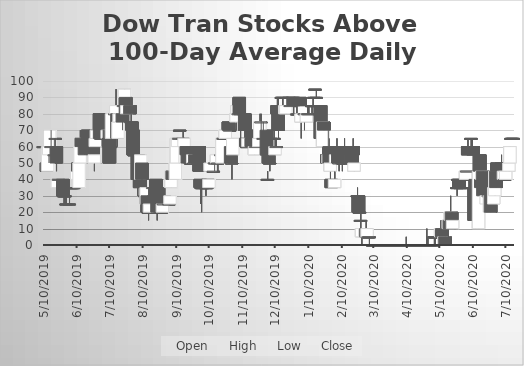
| Category | Open | High | Low | Close |
|---|---|---|---|---|
| 5/10/19 | 60 | 70 | 60 | 60 |
| 5/13/19 | 50 | 55 | 45 | 45 |
| 5/14/19 | 45 | 60 | 45 | 60 |
| 5/15/19 | 55 | 60 | 50 | 60 |
| 5/16/19 | 60 | 70 | 60 | 70 |
| 5/17/19 | 60 | 70 | 60 | 60 |
| 5/20/19 | 55 | 65 | 55 | 55 |
| 5/21/19 | 65 | 65 | 60 | 65 |
| 5/22/19 | 60 | 60 | 45 | 50 |
| 5/23/19 | 35 | 40 | 35 | 40 |
| 5/24/19 | 40 | 40 | 40 | 40 |
| 5/28/19 | 40 | 40 | 30 | 30 |
| 5/29/19 | 30 | 30 | 25 | 30 |
| 5/30/19 | 30 | 30 | 25 | 30 |
| 5/31/19 | 25 | 30 | 25 | 25 |
| 6/3/19 | 25 | 30 | 25 | 25 |
| 6/4/19 | 35 | 35 | 35 | 35 |
| 6/5/19 | 35 | 35 | 35 | 35 |
| 6/6/19 | 35 | 35 | 35 | 35 |
| 6/7/19 | 35 | 40 | 35 | 35 |
| 6/10/19 | 40 | 50 | 40 | 45 |
| 6/11/19 | 50 | 50 | 40 | 45 |
| 6/12/19 | 35 | 50 | 35 | 50 |
| 6/13/19 | 50 | 70 | 50 | 65 |
| 6/14/19 | 65 | 65 | 60 | 60 |
| 6/17/19 | 60 | 60 | 55 | 55 |
| 6/18/19 | 60 | 65 | 60 | 60 |
| 6/19/19 | 60 | 60 | 60 | 60 |
| 6/20/19 | 70 | 70 | 55 | 60 |
| 6/21/19 | 60 | 70 | 55 | 60 |
| 6/24/19 | 60 | 60 | 60 | 60 |
| 6/25/19 | 60 | 60 | 50 | 55 |
| 6/26/19 | 50 | 60 | 45 | 55 |
| 6/27/19 | 60 | 65 | 60 | 65 |
| 6/28/19 | 65 | 70 | 65 | 70 |
| 7/1/19 | 80 | 80 | 65 | 65 |
| 7/2/19 | 65 | 70 | 65 | 65 |
| 7/3/19 | 65 | 70 | 65 | 65 |
| 7/5/19 | 70 | 70 | 65 | 65 |
| 7/8/19 | 65 | 70 | 60 | 70 |
| 7/9/19 | 65 | 70 | 55 | 60 |
| 7/10/19 | 70 | 70 | 50 | 50 |
| 7/11/19 | 60 | 65 | 55 | 60 |
| 7/12/19 | 65 | 85 | 65 | 80 |
| 7/15/19 | 80 | 80 | 80 | 80 |
| 7/16/19 | 80 | 95 | 80 | 85 |
| 7/17/19 | 80 | 80 | 60 | 65 |
| 7/18/19 | 65 | 75 | 65 | 75 |
| 7/19/19 | 75 | 85 | 75 | 80 |
| 7/22/19 | 80 | 85 | 70 | 75 |
| 7/23/19 | 85 | 85 | 80 | 85 |
| 7/24/19 | 90 | 95 | 90 | 95 |
| 7/25/19 | 90 | 90 | 80 | 80 |
| 7/26/19 | 80 | 85 | 80 | 85 |
| 7/29/19 | 85 | 85 | 80 | 80 |
| 7/30/19 | 75 | 80 | 75 | 75 |
| 7/31/19 | 75 | 75 | 70 | 70 |
| 8/1/19 | 70 | 75 | 55 | 55 |
| 8/2/19 | 55 | 55 | 55 | 55 |
| 8/5/19 | 55 | 55 | 30 | 40 |
| 8/6/19 | 55 | 55 | 35 | 45 |
| 8/7/19 | 40 | 40 | 25 | 35 |
| 8/8/19 | 40 | 55 | 35 | 55 |
| 8/9/19 | 50 | 50 | 35 | 40 |
| 8/12/19 | 30 | 35 | 25 | 30 |
| 8/13/19 | 25 | 50 | 25 | 35 |
| 8/14/19 | 30 | 30 | 20 | 20 |
| 8/15/19 | 20 | 20 | 15 | 20 |
| 8/16/19 | 20 | 25 | 20 | 25 |
| 8/19/19 | 35 | 40 | 30 | 35 |
| 8/20/19 | 30 | 35 | 30 | 30 |
| 8/21/19 | 35 | 35 | 30 | 30 |
| 8/22/19 | 40 | 40 | 30 | 30 |
| 8/23/19 | 35 | 35 | 15 | 20 |
| 8/26/19 | 20 | 20 | 20 | 20 |
| 8/27/19 | 20 | 20 | 20 | 20 |
| 8/28/19 | 20 | 25 | 20 | 25 |
| 8/29/19 | 25 | 30 | 25 | 25 |
| 8/30/19 | 30 | 35 | 25 | 30 |
| 9/3/19 | 25 | 25 | 25 | 25 |
| 9/4/19 | 25 | 30 | 25 | 30 |
| 9/5/19 | 35 | 45 | 35 | 45 |
| 9/6/19 | 45 | 45 | 40 | 40 |
| 9/9/19 | 40 | 50 | 40 | 50 |
| 9/10/19 | 50 | 65 | 50 | 65 |
| 9/11/19 | 60 | 65 | 60 | 65 |
| 9/12/19 | 65 | 65 | 65 | 65 |
| 9/13/19 | 70 | 70 | 70 | 70 |
| 9/16/19 | 65 | 70 | 65 | 65 |
| 9/17/19 | 60 | 65 | 55 | 65 |
| 9/18/19 | 50 | 60 | 50 | 60 |
| 9/19/19 | 60 | 60 | 55 | 55 |
| 9/20/19 | 60 | 60 | 50 | 50 |
| 9/23/19 | 50 | 50 | 50 | 50 |
| 9/24/19 | 50 | 50 | 50 | 50 |
| 9/25/19 | 50 | 55 | 50 | 55 |
| 9/26/19 | 50 | 50 | 50 | 50 |
| 9/27/19 | 55 | 55 | 50 | 50 |
| 9/30/19 | 50 | 55 | 50 | 50 |
| 10/1/19 | 60 | 60 | 45 | 45 |
| 10/2/19 | 40 | 40 | 25 | 35 |
| 10/3/19 | 35 | 35 | 20 | 35 |
| 10/4/19 | 35 | 35 | 35 | 35 |
| 10/7/19 | 35 | 35 | 30 | 35 |
| 10/8/19 | 35 | 40 | 35 | 35 |
| 10/9/19 | 40 | 40 | 35 | 40 |
| 10/10/19 | 35 | 40 | 35 | 40 |
| 10/11/19 | 45 | 50 | 45 | 50 |
| 10/14/19 | 45 | 45 | 45 | 45 |
| 10/15/19 | 50 | 50 | 45 | 50 |
| 10/16/19 | 50 | 55 | 50 | 50 |
| 10/17/19 | 50 | 55 | 50 | 55 |
| 10/18/19 | 50 | 55 | 45 | 50 |
| 10/21/19 | 55 | 55 | 50 | 55 |
| 10/22/19 | 50 | 65 | 50 | 65 |
| 10/23/19 | 65 | 65 | 65 | 65 |
| 10/24/19 | 65 | 65 | 65 | 65 |
| 10/25/19 | 65 | 70 | 65 | 70 |
| 10/28/19 | 75 | 75 | 70 | 70 |
| 10/29/19 | 70 | 70 | 70 | 70 |
| 10/30/19 | 60 | 60 | 50 | 50 |
| 10/31/19 | 50 | 50 | 40 | 50 |
| 11/1/19 | 55 | 65 | 50 | 65 |
| 11/4/19 | 75 | 80 | 70 | 80 |
| 11/5/19 | 80 | 85 | 80 | 85 |
| 11/6/19 | 80 | 80 | 80 | 80 |
| 11/7/19 | 90 | 90 | 80 | 80 |
| 11/8/19 | 80 | 85 | 65 | 80 |
| 11/11/19 | 80 | 80 | 70 | 80 |
| 11/12/19 | 80 | 80 | 65 | 70 |
| 11/13/19 | 65 | 65 | 60 | 60 |
| 11/14/19 | 60 | 60 | 60 | 60 |
| 11/15/19 | 60 | 65 | 60 | 65 |
| 11/18/19 | 65 | 65 | 60 | 60 |
| 11/19/19 | 70 | 70 | 60 | 60 |
| 11/20/19 | 60 | 60 | 60 | 60 |
| 11/21/19 | 55 | 60 | 55 | 60 |
| 11/22/19 | 60 | 60 | 60 | 60 |
| 11/25/19 | 60 | 65 | 60 | 65 |
| 11/26/19 | 65 | 80 | 65 | 75 |
| 11/27/19 | 75 | 80 | 60 | 75 |
| 11/29/19 | 65 | 75 | 65 | 65 |
| 12/2/19 | 70 | 70 | 55 | 55 |
| 12/3/19 | 40 | 45 | 40 | 40 |
| 12/4/19 | 55 | 60 | 50 | 50 |
| 12/5/19 | 50 | 55 | 45 | 50 |
| 12/6/19 | 65 | 70 | 55 | 65 |
| 12/9/19 | 65 | 70 | 65 | 65 |
| 12/10/19 | 55 | 65 | 55 | 60 |
| 12/11/19 | 60 | 65 | 60 | 60 |
| 12/12/19 | 85 | 90 | 75 | 80 |
| 12/13/19 | 85 | 90 | 65 | 70 |
| 12/16/19 | 90 | 90 | 90 | 90 |
| 12/17/19 | 90 | 90 | 85 | 90 |
| 12/18/19 | 85 | 85 | 80 | 80 |
| 12/19/19 | 80 | 85 | 80 | 85 |
| 12/20/19 | 80 | 85 | 80 | 85 |
| 12/23/19 | 90 | 90 | 90 | 90 |
| 12/24/19 | 85 | 90 | 85 | 85 |
| 12/26/19 | 90 | 90 | 90 | 90 |
| 12/27/19 | 90 | 90 | 80 | 85 |
| 12/30/19 | 80 | 85 | 80 | 80 |
| 12/31/19 | 80 | 80 | 80 | 80 |
| 1/2/20 | 90 | 90 | 85 | 85 |
| 1/3/20 | 75 | 80 | 65 | 80 |
| 1/6/20 | 80 | 80 | 70 | 80 |
| 1/7/20 | 80 | 80 | 75 | 80 |
| 1/8/20 | 75 | 80 | 75 | 80 |
| 1/9/20 | 80 | 85 | 80 | 80 |
| 1/10/20 | 80 | 85 | 80 | 80 |
| 1/13/20 | 85 | 85 | 80 | 85 |
| 1/14/20 | 85 | 90 | 85 | 85 |
| 1/15/20 | 90 | 90 | 90 | 90 |
| 1/16/20 | 95 | 95 | 95 | 95 |
| 1/17/20 | 90 | 95 | 90 | 90 |
| 1/21/20 | 85 | 85 | 65 | 65 |
| 1/22/20 | 75 | 80 | 70 | 70 |
| 1/23/20 | 60 | 75 | 60 | 75 |
| 1/24/20 | 75 | 75 | 70 | 70 |
| 1/27/20 | 55 | 60 | 50 | 50 |
| 1/28/20 | 50 | 70 | 50 | 55 |
| 1/29/20 | 60 | 65 | 50 | 50 |
| 1/30/20 | 45 | 50 | 40 | 50 |
| 1/31/20 | 40 | 40 | 35 | 35 |
| 2/3/20 | 35 | 45 | 35 | 40 |
| 2/4/20 | 50 | 55 | 50 | 55 |
| 2/5/20 | 60 | 65 | 55 | 60 |
| 2/6/20 | 60 | 60 | 50 | 50 |
| 2/7/20 | 50 | 55 | 45 | 50 |
| 2/10/20 | 50 | 55 | 45 | 50 |
| 2/11/20 | 60 | 60 | 55 | 55 |
| 2/12/20 | 60 | 65 | 55 | 55 |
| 2/13/20 | 60 | 60 | 55 | 60 |
| 2/14/20 | 60 | 60 | 55 | 55 |
| 2/18/20 | 60 | 60 | 50 | 55 |
| 2/19/20 | 55 | 55 | 50 | 50 |
| 2/20/20 | 60 | 65 | 55 | 55 |
| 2/21/20 | 45 | 50 | 45 | 50 |
| 2/24/20 | 30 | 35 | 30 | 30 |
| 2/25/20 | 30 | 30 | 20 | 20 |
| 2/26/20 | 20 | 20 | 20 | 20 |
| 2/27/20 | 15 | 20 | 10 | 15 |
| 2/28/20 | 5 | 10 | 0.01 | 10 |
| 3/2/20 | 5 | 10 | 5 | 10 |
| 3/3/20 | 10 | 15 | 5 | 5 |
| 3/4/20 | 5 | 10 | 5 | 10 |
| 3/5/20 | 5 | 5 | 5 | 5 |
| 3/6/20 | 5 | 5 | 0.01 | 5 |
| 3/9/20 | 0.01 | 0.01 | 0.01 | 0.01 |
| 3/10/20 | 0.01 | 0.01 | 0.01 | 0.01 |
| 3/11/20 | 0.01 | 0.01 | 0.01 | 0.01 |
| 3/12/20 | 0.01 | 0.01 | 0.01 | 0.01 |
| 3/13/20 | 0.01 | 0.01 | 0.01 | 0.01 |
| 3/16/20 | 0.01 | 0.01 | 0.01 | 0.01 |
| 3/17/20 | 0.01 | 0.01 | 0.01 | 0.01 |
| 3/18/20 | 0.01 | 0.01 | 0.01 | 0.01 |
| 3/19/20 | 0.01 | 0.01 | 0.01 | 0.01 |
| 3/20/20 | 0.01 | 0.01 | 0.01 | 0.01 |
| 3/23/20 | 0.01 | 0.01 | 0.01 | 0.01 |
| 3/24/20 | 0.01 | 0.01 | 0.01 | 0.01 |
| 3/25/20 | 0.01 | 0.01 | 0.01 | 0.01 |
| 3/26/20 | 0.01 | 0.01 | 0.01 | 0.01 |
| 3/27/20 | 0.01 | 0.01 | 0.01 | 0.01 |
| 3/30/20 | 0.01 | 0.01 | 0.01 | 0.01 |
| 3/31/20 | 0.01 | 0.01 | 0.01 | 0.01 |
| 4/1/20 | 0.01 | 0.01 | 0.01 | 0.01 |
| 4/2/20 | 0.01 | 0.01 | 0.01 | 0.01 |
| 4/3/20 | 0.01 | 0.01 | 0.01 | 0.01 |
| 4/6/20 | 0.01 | 0.01 | 0.01 | 0.01 |
| 4/7/20 | 0.01 | 0.01 | 0.01 | 0.01 |
| 4/8/20 | 0.01 | 0.01 | 0.01 | 0.01 |
| 4/9/20 | 0.01 | 5 | 0.01 | 0.01 |
| 4/13/20 | 0.01 | 0.01 | 0.01 | 0.01 |
| 4/14/20 | 0.01 | 0.01 | 0.01 | 0.01 |
| 4/15/20 | 0.01 | 0.01 | 0.01 | 0.01 |
| 4/16/20 | 0.01 | 0.01 | 0.01 | 0.01 |
| 4/17/20 | 0.01 | 0.01 | 0.01 | 0.01 |
| 4/20/20 | 0.01 | 0.01 | 0.01 | 0.01 |
| 4/21/20 | 0.01 | 0.01 | 0.01 | 0.01 |
| 4/22/20 | 0.01 | 0.01 | 0.01 | 0.01 |
| 4/23/20 | 0.01 | 0.01 | 0.01 | 0.01 |
| 4/24/20 | 0.01 | 0.01 | 0.01 | 0.01 |
| 4/27/20 | 0.01 | 0.01 | 0.01 | 0.01 |
| 4/28/20 | 0.01 | 10 | 0.01 | 0.01 |
| 4/29/20 | 0.01 | 5 | 0.01 | 0.01 |
| 4/30/20 | 0.01 | 0.01 | 0.01 | 0.01 |
| 5/1/20 | 0.01 | 0.01 | 0.01 | 0.01 |
| 5/4/20 | 0.01 | 0.01 | 0.01 | 0.01 |
| 5/5/20 | 5 | 5 | 0.01 | 5 |
| 5/6/20 | 5 | 5 | 0.01 | 5 |
| 5/7/20 | 5 | 5 | 5 | 5 |
| 5/8/20 | 5 | 5 | 5 | 5 |
| 5/11/20 | 5 | 15 | 5 | 10 |
| 5/12/20 | 10 | 15 | 5 | 5 |
| 5/13/20 | 5 | 5 | 0.01 | 5 |
| 5/14/20 | 0.01 | 5 | 0.01 | 5 |
| 5/15/20 | 5 | 5 | 0.01 | 0.01 |
| 5/18/20 | 10 | 15 | 0.01 | 15 |
| 5/19/20 | 15 | 15 | 10 | 10 |
| 5/20/20 | 15 | 30 | 15 | 20 |
| 5/21/20 | 20 | 20 | 10 | 10 |
| 5/22/20 | 10 | 20 | 10 | 15 |
| 5/26/20 | 35 | 40 | 30 | 35 |
| 5/27/20 | 40 | 40 | 40 | 40 |
| 5/28/20 | 40 | 40 | 35 | 35 |
| 5/29/20 | 35 | 35 | 35 | 35 |
| 6/1/20 | 35 | 35 | 35 | 35 |
| 6/2/20 | 40 | 40 | 35 | 40 |
| 6/3/20 | 40 | 45 | 40 | 45 |
| 6/4/20 | 45 | 45 | 45 | 45 |
| 6/5/20 | 60 | 65 | 55 | 55 |
| 6/8/20 | 65 | 65 | 60 | 65 |
| 6/9/20 | 60 | 65 | 55 | 60 |
| 6/10/20 | 60 | 60 | 45 | 55 |
| 6/11/20 | 35 | 40 | 15 | 15 |
| 6/12/20 | 40 | 40 | 10 | 30 |
| 6/15/20 | 10 | 45 | 10 | 45 |
| 6/16/20 | 55 | 55 | 40 | 45 |
| 6/17/20 | 40 | 45 | 35 | 35 |
| 6/18/20 | 40 | 45 | 40 | 45 |
| 6/19/20 | 45 | 45 | 25 | 30 |
| 6/22/20 | 25 | 30 | 25 | 30 |
| 6/23/20 | 40 | 45 | 40 | 40 |
| 6/24/20 | 30 | 35 | 25 | 30 |
| 6/25/20 | 20 | 30 | 20 | 30 |
| 6/26/20 | 35 | 35 | 20 | 20 |
| 6/29/20 | 25 | 35 | 25 | 35 |
| 6/30/20 | 30 | 45 | 30 | 45 |
| 7/1/20 | 45 | 45 | 35 | 35 |
| 7/2/20 | 50 | 50 | 45 | 45 |
| 7/6/20 | 50 | 55 | 50 | 50 |
| 7/7/20 | 50 | 50 | 40 | 40 |
| 7/8/20 | 40 | 45 | 40 | 45 |
| 7/9/20 | 40 | 40 | 40 | 40 |
| 7/10/20 | 40 | 45 | 40 | 45 |
| 7/13/20 | 45 | 60 | 45 | 50 |
| 7/14/20 | 50 | 60 | 50 | 60 |
| 7/15/20 | 65 | 65 | 65 | 65 |
| 7/16/20 | 65 | 65 | 65 | 65 |
| 7/17/20 | 65 | 65 | 65 | 65 |